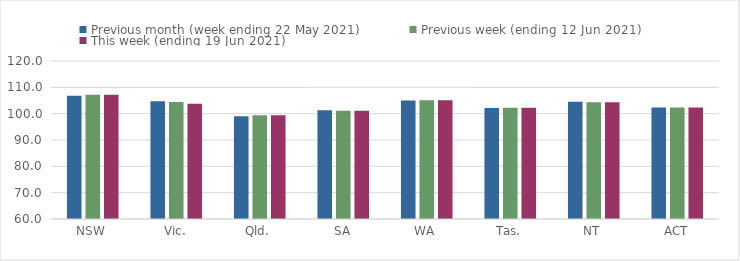
| Category | Previous month (week ending 22 May 2021) | Previous week (ending 12 Jun 2021) | This week (ending 19 Jun 2021) |
|---|---|---|---|
| NSW | 106.81 | 107.16 | 107.16 |
| Vic. | 104.67 | 104.41 | 103.79 |
| Qld. | 98.99 | 99.44 | 99.44 |
| SA | 101.29 | 101.15 | 101.15 |
| WA | 104.98 | 105.09 | 105.09 |
| Tas. | 102.12 | 102.26 | 102.26 |
| NT | 104.51 | 104.31 | 104.31 |
| ACT | 102.3 | 102.38 | 102.38 |